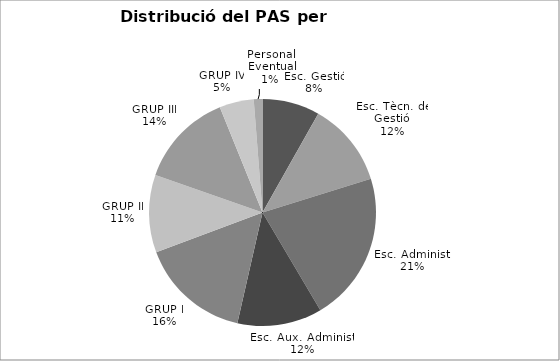
| Category | Series 0 |
|---|---|
| Esc. Gestió | 132 |
| Esc. Tècn. de Gestió | 194 |
| Esc. Administ. | 344 |
| Esc. Aux. Administ. | 195 |
| GRUP I | 254 |
| GRUP II | 179 |
| GRUP III | 218 |
| GRUP IV | 79 |
| Personal Eventual | 20 |